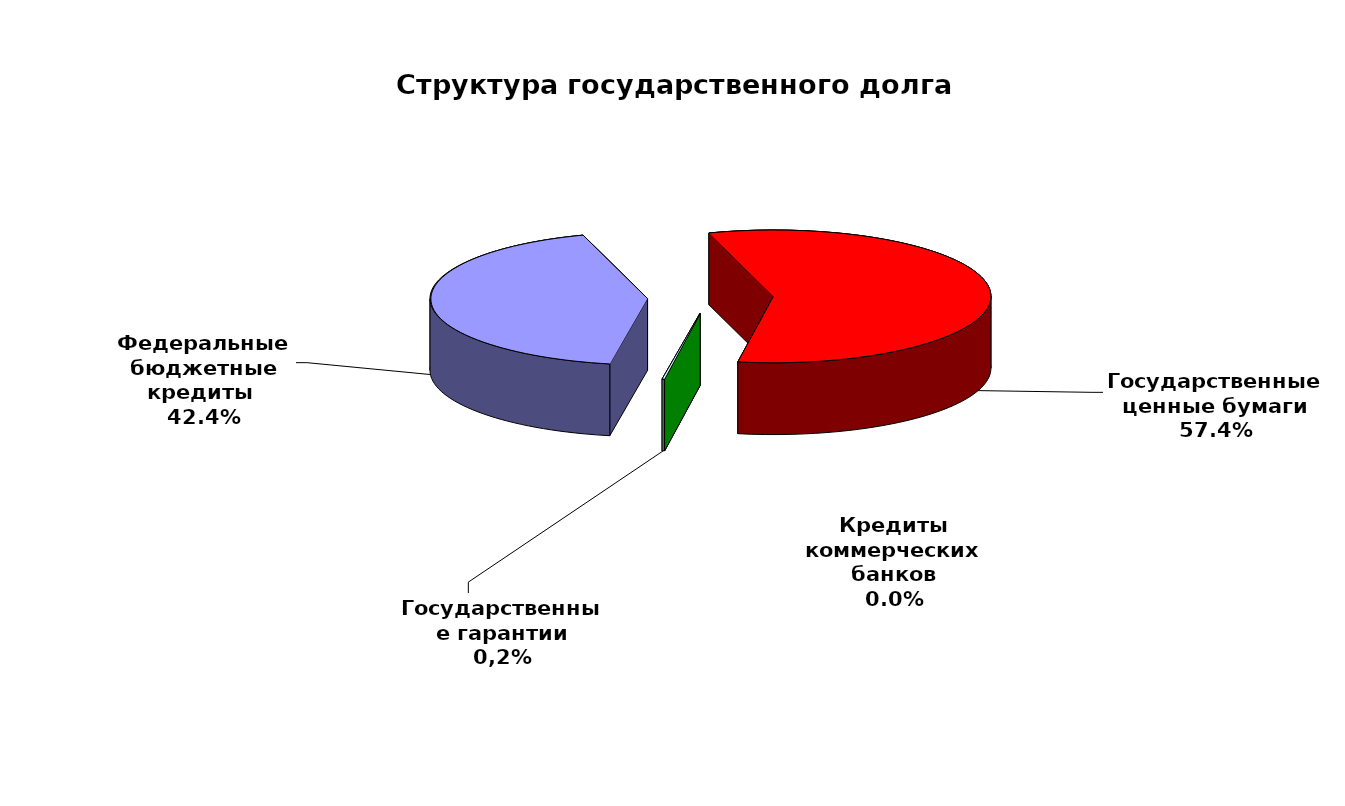
| Category | Series 0 |
|---|---|
| Федеральные бюджетные кредиты  | 36662617.913 |
| Государственные ценные бумаги | 49600000 |
| Кредиты коммерческих банков | 0 |
| Государственные гарантии | 141570.67 |